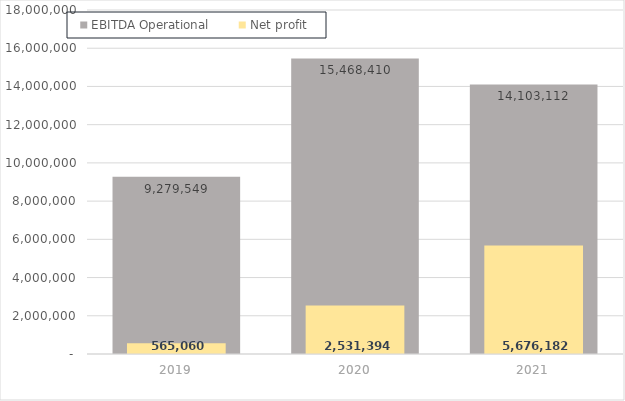
| Category | EBITDA Operational |
|---|---|
| 2019.0 | 9279549.099 |
| 2020.0 | 15468410.008 |
| 2021.0 | 14103111.729 |